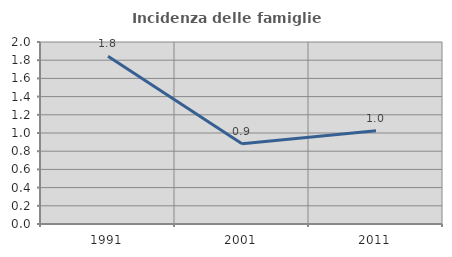
| Category | Incidenza delle famiglie numerose |
|---|---|
| 1991.0 | 1.844 |
| 2001.0 | 0.883 |
| 2011.0 | 1.026 |